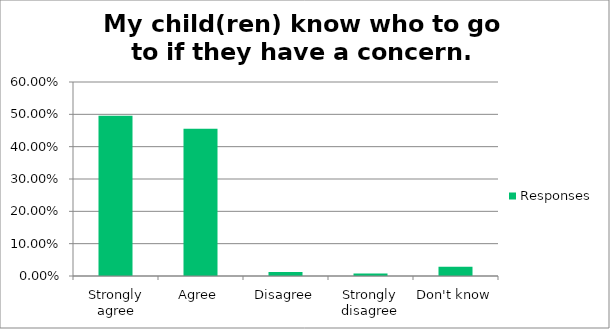
| Category | Responses |
|---|---|
| Strongly agree | 0.496 |
| Agree | 0.455 |
| Disagree | 0.012 |
| Strongly disagree | 0.008 |
| Don't know | 0.028 |